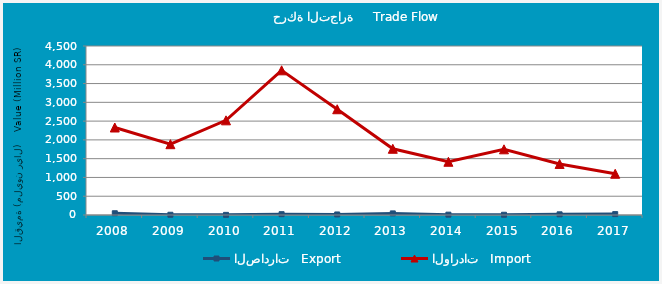
| Category | الصادرات   Export | الواردات   Import |
|---|---|---|
| 2008.0 | 46705746 | 2329752333 |
| 2009.0 | 6355259 | 1885266091 |
| 2010.0 | 3645100 | 2520581755 |
| 2011.0 | 22043707 | 3852372644 |
| 2012.0 | 14181835 | 2816138392 |
| 2013.0 | 42737688 | 1763447407 |
| 2014.0 | 8872343 | 1417389251 |
| 2015.0 | 6397397 | 1748896734 |
| 2016.0 | 18242399 | 1359043484 |
| 2017.0 | 23590581 | 1097711442 |